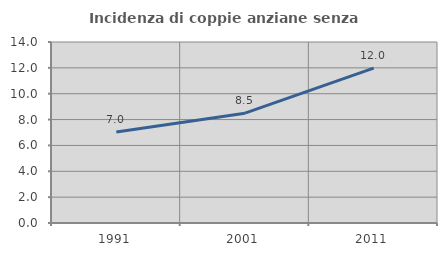
| Category | Incidenza di coppie anziane senza figli  |
|---|---|
| 1991.0 | 7.034 |
| 2001.0 | 8.492 |
| 2011.0 | 11.975 |